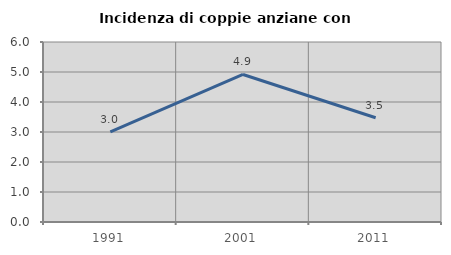
| Category | Incidenza di coppie anziane con figli |
|---|---|
| 1991.0 | 3.008 |
| 2001.0 | 4.918 |
| 2011.0 | 3.475 |